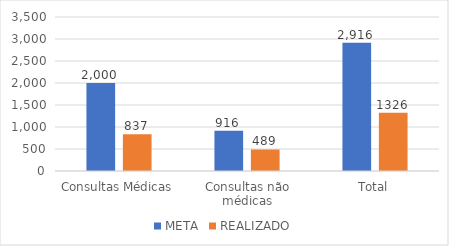
| Category | META | REALIZADO |
|---|---|---|
| Consultas Médicas | 2000 | 837 |
| Consultas não médicas | 916 | 489 |
| Total | 2916 | 1326 |